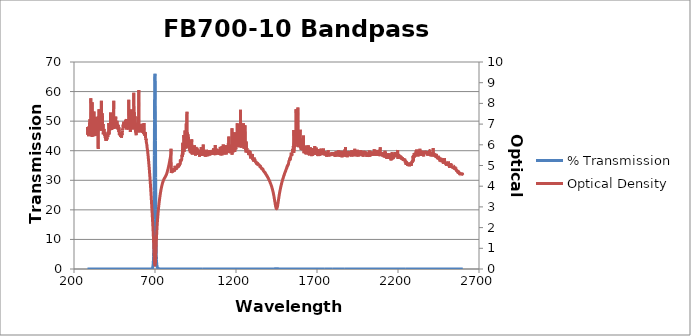
| Category | % Transmission |
|---|---|
| 2600.0 | 0.003 |
| 2599.0 | 0.003 |
| 2598.0 | 0.002 |
| 2597.0 | 0.003 |
| 2596.0 | 0.003 |
| 2595.0 | 0.003 |
| 2594.0 | 0.003 |
| 2593.0 | 0.003 |
| 2592.0 | 0.003 |
| 2591.0 | 0.003 |
| 2590.0 | 0.003 |
| 2589.0 | 0.002 |
| 2588.0 | 0.003 |
| 2587.0 | 0.003 |
| 2586.0 | 0.002 |
| 2585.0 | 0.002 |
| 2584.0 | 0.002 |
| 2583.0 | 0.002 |
| 2582.0 | 0.003 |
| 2581.0 | 0.002 |
| 2580.0 | 0.002 |
| 2579.0 | 0.003 |
| 2578.0 | 0.002 |
| 2577.0 | 0.002 |
| 2576.0 | 0.002 |
| 2575.0 | 0.002 |
| 2574.0 | 0.002 |
| 2573.0 | 0.002 |
| 2572.0 | 0.002 |
| 2571.0 | 0.002 |
| 2570.0 | 0.002 |
| 2569.0 | 0.002 |
| 2568.0 | 0.002 |
| 2567.0 | 0.002 |
| 2566.0 | 0.002 |
| 2565.0 | 0.002 |
| 2564.0 | 0.002 |
| 2563.0 | 0.002 |
| 2562.0 | 0.002 |
| 2561.0 | 0.002 |
| 2560.0 | 0.002 |
| 2559.0 | 0.001 |
| 2558.0 | 0.001 |
| 2557.0 | 0.001 |
| 2556.0 | 0.001 |
| 2555.0 | 0.001 |
| 2554.0 | 0.002 |
| 2553.0 | 0.001 |
| 2552.0 | 0.001 |
| 2551.0 | 0.001 |
| 2550.0 | 0.001 |
| 2549.0 | 0.001 |
| 2548.0 | 0.002 |
| 2547.0 | 0.001 |
| 2546.0 | 0.001 |
| 2545.0 | 0.001 |
| 2544.0 | 0.001 |
| 2543.0 | 0.001 |
| 2542.0 | 0.001 |
| 2541.0 | 0.001 |
| 2540.0 | 0.001 |
| 2539.0 | 0.001 |
| 2538.0 | 0.001 |
| 2537.0 | 0.001 |
| 2536.0 | 0.001 |
| 2535.0 | 0.001 |
| 2534.0 | 0.001 |
| 2533.0 | 0.001 |
| 2532.0 | 0.001 |
| 2531.0 | 0.001 |
| 2530.0 | 0.001 |
| 2529.0 | 0.001 |
| 2528.0 | 0.001 |
| 2527.0 | 0.001 |
| 2526.0 | 0.001 |
| 2525.0 | 0.001 |
| 2524.0 | 0.001 |
| 2523.0 | 0.001 |
| 2522.0 | 0.001 |
| 2521.0 | 0.001 |
| 2520.0 | 0.001 |
| 2519.0 | 0.001 |
| 2518.0 | 0.001 |
| 2517.0 | 0.001 |
| 2516.0 | 0.001 |
| 2515.0 | 0.001 |
| 2514.0 | 0.001 |
| 2513.0 | 0.001 |
| 2512.0 | 0.001 |
| 2511.0 | 0.001 |
| 2510.0 | 0.001 |
| 2509.0 | 0.001 |
| 2508.0 | 0.001 |
| 2507.0 | 0.001 |
| 2506.0 | 0.001 |
| 2505.0 | 0.001 |
| 2504.0 | 0.001 |
| 2503.0 | 0.001 |
| 2502.0 | 0.001 |
| 2501.0 | 0.001 |
| 2500.0 | 0.001 |
| 2499.0 | 0.001 |
| 2498.0 | 0.001 |
| 2497.0 | 0.001 |
| 2496.0 | 0.001 |
| 2495.0 | 0.001 |
| 2494.0 | 0.001 |
| 2493.0 | 0.001 |
| 2492.0 | 0.001 |
| 2491.0 | 0.001 |
| 2490.0 | 0.001 |
| 2489.0 | 0.001 |
| 2488.0 | 0.001 |
| 2487.0 | 0 |
| 2486.0 | 0.001 |
| 2485.0 | 0.001 |
| 2484.0 | 0.001 |
| 2483.0 | 0.001 |
| 2482.0 | 0.001 |
| 2481.0 | 0.001 |
| 2480.0 | 0.001 |
| 2479.0 | 0.001 |
| 2478.0 | 0.001 |
| 2477.0 | 0.001 |
| 2476.0 | 0.001 |
| 2475.0 | 0.001 |
| 2474.0 | 0 |
| 2473.0 | 0 |
| 2472.0 | 0.001 |
| 2471.0 | 0.001 |
| 2470.0 | 0.001 |
| 2469.0 | 0 |
| 2468.0 | 0.001 |
| 2467.0 | 0.001 |
| 2466.0 | 0.001 |
| 2465.0 | 0 |
| 2464.0 | 0.001 |
| 2463.0 | 0 |
| 2462.0 | 0 |
| 2461.0 | 0.001 |
| 2460.0 | 0.001 |
| 2459.0 | 0 |
| 2458.0 | 0.001 |
| 2457.0 | 0.001 |
| 2456.0 | 0 |
| 2455.0 | 0 |
| 2454.0 | 0.001 |
| 2453.0 | 0 |
| 2452.0 | 0 |
| 2451.0 | 0 |
| 2450.0 | 0.001 |
| 2449.0 | 0 |
| 2448.0 | 0 |
| 2447.0 | 0 |
| 2446.0 | 0 |
| 2445.0 | 0 |
| 2444.0 | 0 |
| 2443.0 | 0 |
| 2442.0 | 0 |
| 2441.0 | 0 |
| 2440.0 | 0 |
| 2439.0 | 0 |
| 2438.0 | 0 |
| 2437.0 | 0 |
| 2436.0 | 0 |
| 2435.0 | 0 |
| 2434.0 | 0 |
| 2433.0 | 0 |
| 2432.0 | 0 |
| 2431.0 | 0 |
| 2430.0 | 0 |
| 2429.0 | 0 |
| 2428.0 | 0 |
| 2427.0 | 0 |
| 2426.0 | 0 |
| 2425.0 | 0 |
| 2424.0 | 0 |
| 2423.0 | 0 |
| 2422.0 | 0 |
| 2421.0 | 0 |
| 2420.0 | 0 |
| 2419.0 | 0 |
| 2418.0 | 0 |
| 2417.0 | 0 |
| 2416.0 | 0 |
| 2415.0 | 0 |
| 2414.0 | 0 |
| 2413.0 | 0 |
| 2412.0 | 0 |
| 2411.0 | 0 |
| 2410.0 | 0 |
| 2409.0 | 0 |
| 2408.0 | 0 |
| 2407.0 | 0 |
| 2406.0 | 0 |
| 2405.0 | 0 |
| 2404.0 | 0 |
| 2403.0 | 0 |
| 2402.0 | 0 |
| 2401.0 | 0 |
| 2400.0 | 0 |
| 2399.0 | 0 |
| 2398.0 | 0 |
| 2397.0 | 0 |
| 2396.0 | 0 |
| 2395.0 | 0 |
| 2394.0 | 0 |
| 2393.0 | 0 |
| 2392.0 | 0 |
| 2391.0 | 0 |
| 2390.0 | 0 |
| 2389.0 | 0 |
| 2388.0 | 0 |
| 2387.0 | 0 |
| 2386.0 | 0 |
| 2385.0 | 0 |
| 2384.0 | 0 |
| 2383.0 | 0 |
| 2382.0 | 0 |
| 2381.0 | 0 |
| 2380.0 | 0 |
| 2379.0 | 0 |
| 2378.0 | 0 |
| 2377.0 | 0 |
| 2376.0 | 0 |
| 2375.0 | 0 |
| 2374.0 | 0 |
| 2373.0 | 0 |
| 2372.0 | 0 |
| 2371.0 | 0 |
| 2370.0 | 0 |
| 2369.0 | 0 |
| 2368.0 | 0 |
| 2367.0 | 0 |
| 2366.0 | 0 |
| 2365.0 | 0 |
| 2364.0 | 0 |
| 2363.0 | 0 |
| 2362.0 | 0 |
| 2361.0 | 0 |
| 2360.0 | 0 |
| 2359.0 | 0 |
| 2358.0 | 0 |
| 2357.0 | 0 |
| 2356.0 | 0 |
| 2355.0 | 0 |
| 2354.0 | 0 |
| 2353.0 | 0 |
| 2352.0 | 0 |
| 2351.0 | 0 |
| 2350.0 | 0 |
| 2349.0 | 0 |
| 2348.0 | 0 |
| 2347.0 | 0 |
| 2346.0 | 0 |
| 2345.0 | 0 |
| 2344.0 | 0 |
| 2343.0 | 0 |
| 2342.0 | 0 |
| 2341.0 | 0 |
| 2340.0 | 0 |
| 2339.0 | 0 |
| 2338.0 | 0 |
| 2337.0 | 0 |
| 2336.0 | 0 |
| 2335.0 | 0 |
| 2334.0 | 0 |
| 2333.0 | 0 |
| 2332.0 | 0 |
| 2331.0 | 0 |
| 2330.0 | 0 |
| 2329.0 | 0 |
| 2328.0 | 0 |
| 2327.0 | 0 |
| 2326.0 | 0 |
| 2325.0 | 0 |
| 2324.0 | 0 |
| 2323.0 | 0 |
| 2322.0 | 0 |
| 2321.0 | 0 |
| 2320.0 | 0 |
| 2319.0 | 0 |
| 2318.0 | 0 |
| 2317.0 | 0 |
| 2316.0 | 0 |
| 2315.0 | 0 |
| 2314.0 | 0 |
| 2313.0 | 0 |
| 2312.0 | 0 |
| 2311.0 | 0 |
| 2310.0 | 0 |
| 2309.0 | 0 |
| 2308.0 | 0 |
| 2307.0 | 0 |
| 2306.0 | 0 |
| 2305.0 | 0 |
| 2304.0 | 0 |
| 2303.0 | 0 |
| 2302.0 | 0 |
| 2301.0 | 0 |
| 2300.0 | 0 |
| 2299.0 | 0 |
| 2298.0 | 0 |
| 2297.0 | 0 |
| 2296.0 | 0 |
| 2295.0 | 0.001 |
| 2294.0 | 0.001 |
| 2293.0 | 0 |
| 2292.0 | 0.001 |
| 2291.0 | 0.001 |
| 2290.0 | 0.001 |
| 2289.0 | 0.001 |
| 2288.0 | 0.001 |
| 2287.0 | 0.001 |
| 2286.0 | 0.001 |
| 2285.0 | 0.001 |
| 2284.0 | 0.001 |
| 2283.0 | 0.001 |
| 2282.0 | 0.001 |
| 2281.0 | 0.001 |
| 2280.0 | 0.001 |
| 2279.0 | 0.001 |
| 2278.0 | 0.001 |
| 2277.0 | 0.001 |
| 2276.0 | 0.001 |
| 2275.0 | 0.001 |
| 2274.0 | 0.001 |
| 2273.0 | 0.001 |
| 2272.0 | 0.001 |
| 2271.0 | 0.001 |
| 2270.0 | 0.001 |
| 2269.0 | 0.001 |
| 2268.0 | 0.001 |
| 2267.0 | 0.001 |
| 2266.0 | 0.001 |
| 2265.0 | 0.001 |
| 2264.0 | 0.001 |
| 2263.0 | 0.001 |
| 2262.0 | 0.001 |
| 2261.0 | 0.001 |
| 2260.0 | 0.001 |
| 2259.0 | 0.001 |
| 2258.0 | 0.001 |
| 2257.0 | 0.001 |
| 2256.0 | 0.001 |
| 2255.0 | 0.001 |
| 2254.0 | 0.001 |
| 2253.0 | 0.001 |
| 2252.0 | 0.001 |
| 2251.0 | 0.001 |
| 2250.0 | 0.001 |
| 2249.0 | 0.001 |
| 2248.0 | 0.001 |
| 2247.0 | 0.001 |
| 2246.0 | 0.001 |
| 2245.0 | 0.001 |
| 2244.0 | 0.001 |
| 2243.0 | 0.001 |
| 2242.0 | 0 |
| 2241.0 | 0.001 |
| 2240.0 | 0.001 |
| 2239.0 | 0.001 |
| 2238.0 | 0 |
| 2237.0 | 0.001 |
| 2236.0 | 0.001 |
| 2235.0 | 0.001 |
| 2234.0 | 0.001 |
| 2233.0 | 0.001 |
| 2232.0 | 0 |
| 2231.0 | 0 |
| 2230.0 | 0 |
| 2229.0 | 0.001 |
| 2228.0 | 0 |
| 2227.0 | 0.001 |
| 2226.0 | 0 |
| 2225.0 | 0 |
| 2224.0 | 0 |
| 2223.0 | 0 |
| 2222.0 | 0.001 |
| 2221.0 | 0 |
| 2220.0 | 0 |
| 2219.0 | 0 |
| 2218.0 | 0 |
| 2217.0 | 0 |
| 2216.0 | 0 |
| 2215.0 | 0 |
| 2214.0 | 0 |
| 2213.0 | 0 |
| 2212.0 | 0 |
| 2211.0 | 0 |
| 2210.0 | 0 |
| 2209.0 | 0 |
| 2208.0 | 0 |
| 2207.0 | 0 |
| 2206.0 | 0 |
| 2205.0 | 0 |
| 2204.0 | 0 |
| 2203.0 | 0 |
| 2202.0 | 0 |
| 2201.0 | 0 |
| 2200.0 | 0 |
| 2199.0 | 0 |
| 2198.0 | 0 |
| 2197.0 | 0 |
| 2196.0 | 0 |
| 2195.0 | 0 |
| 2194.0 | 0 |
| 2193.0 | 0 |
| 2192.0 | 0 |
| 2191.0 | 0 |
| 2190.0 | 0 |
| 2189.0 | 0 |
| 2188.0 | 0 |
| 2187.0 | 0 |
| 2186.0 | 0 |
| 2185.0 | 0 |
| 2184.0 | 0 |
| 2183.0 | 0 |
| 2182.0 | 0 |
| 2181.0 | 0 |
| 2180.0 | 0 |
| 2179.0 | 0 |
| 2178.0 | 0 |
| 2177.0 | 0 |
| 2176.0 | 0 |
| 2175.0 | 0 |
| 2174.0 | 0 |
| 2173.0 | 0 |
| 2172.0 | 0 |
| 2171.0 | 0 |
| 2170.0 | 0 |
| 2169.0 | 0 |
| 2168.0 | 0 |
| 2167.0 | 0 |
| 2166.0 | 0 |
| 2165.0 | 0 |
| 2164.0 | 0 |
| 2163.0 | 0 |
| 2162.0 | 0 |
| 2161.0 | 0 |
| 2160.0 | 0 |
| 2159.0 | 0.001 |
| 2158.0 | 0 |
| 2157.0 | 0.001 |
| 2156.0 | 0 |
| 2155.0 | 0 |
| 2154.0 | 0 |
| 2153.0 | 0 |
| 2152.0 | 0 |
| 2151.0 | 0 |
| 2150.0 | 0 |
| 2149.0 | 0 |
| 2148.0 | 0 |
| 2147.0 | 0 |
| 2146.0 | 0 |
| 2145.0 | 0 |
| 2144.0 | 0 |
| 2143.0 | 0 |
| 2142.0 | 0 |
| 2141.0 | 0 |
| 2140.0 | 0 |
| 2139.0 | 0 |
| 2138.0 | 0 |
| 2137.0 | 0 |
| 2136.0 | 0 |
| 2135.0 | 0 |
| 2134.0 | 0 |
| 2133.0 | 0 |
| 2132.0 | 0 |
| 2131.0 | 0 |
| 2130.0 | 0 |
| 2129.0 | 0 |
| 2128.0 | 0 |
| 2127.0 | 0 |
| 2126.0 | 0 |
| 2125.0 | 0 |
| 2124.0 | 0 |
| 2123.0 | 0 |
| 2122.0 | 0 |
| 2121.0 | 0 |
| 2120.0 | 0 |
| 2119.0 | 0 |
| 2118.0 | 0 |
| 2117.0 | 0 |
| 2116.0 | 0 |
| 2115.0 | 0 |
| 2114.0 | 0 |
| 2113.0 | 0 |
| 2112.0 | 0 |
| 2111.0 | 0 |
| 2110.0 | 0 |
| 2109.0 | 0 |
| 2108.0 | 0 |
| 2107.0 | 0 |
| 2106.0 | 0 |
| 2105.0 | 0 |
| 2104.0 | 0 |
| 2103.0 | 0 |
| 2102.0 | 0 |
| 2101.0 | 0 |
| 2100.0 | 0 |
| 2099.0 | 0 |
| 2098.0 | 0 |
| 2097.0 | 0 |
| 2096.0 | 0 |
| 2095.0 | 0 |
| 2094.0 | 0 |
| 2093.0 | 0 |
| 2092.0 | 0 |
| 2091.0 | 0 |
| 2090.0 | 0 |
| 2089.0 | 0 |
| 2088.0 | 0 |
| 2087.0 | 0 |
| 2086.0 | 0 |
| 2085.0 | 0 |
| 2084.0 | 0 |
| 2083.0 | 0 |
| 2082.0 | 0 |
| 2081.0 | 0 |
| 2080.0 | 0 |
| 2079.0 | 0 |
| 2078.0 | 0 |
| 2077.0 | 0 |
| 2076.0 | 0 |
| 2075.0 | 0 |
| 2074.0 | 0 |
| 2073.0 | 0 |
| 2072.0 | 0 |
| 2071.0 | 0 |
| 2070.0 | 0 |
| 2069.0 | 0 |
| 2068.0 | 0 |
| 2067.0 | 0 |
| 2066.0 | 0 |
| 2065.0 | 0 |
| 2064.0 | 0 |
| 2063.0 | 0 |
| 2062.0 | 0 |
| 2061.0 | 0 |
| 2060.0 | 0 |
| 2059.0 | 0 |
| 2058.0 | 0 |
| 2057.0 | 0 |
| 2056.0 | 0 |
| 2055.0 | 0 |
| 2054.0 | 0 |
| 2053.0 | 0 |
| 2052.0 | 0 |
| 2051.0 | 0 |
| 2050.0 | 0 |
| 2049.0 | 0 |
| 2048.0 | 0 |
| 2047.0 | 0 |
| 2046.0 | 0 |
| 2045.0 | 0 |
| 2044.0 | 0 |
| 2043.0 | 0 |
| 2042.0 | 0 |
| 2041.0 | 0 |
| 2040.0 | 0 |
| 2039.0 | 0 |
| 2038.0 | 0 |
| 2037.0 | 0 |
| 2036.0 | 0 |
| 2035.0 | 0 |
| 2034.0 | 0 |
| 2033.0 | 0 |
| 2032.0 | 0 |
| 2031.0 | 0 |
| 2030.0 | 0 |
| 2029.0 | 0 |
| 2028.0 | 0 |
| 2027.0 | 0 |
| 2026.0 | 0 |
| 2025.0 | 0 |
| 2024.0 | 0 |
| 2023.0 | 0 |
| 2022.0 | 0 |
| 2021.0 | 0 |
| 2020.0 | 0 |
| 2019.0 | 0 |
| 2018.0 | 0 |
| 2017.0 | 0 |
| 2016.0 | 0 |
| 2015.0 | 0 |
| 2014.0 | 0 |
| 2013.0 | 0 |
| 2012.0 | 0 |
| 2011.0 | 0 |
| 2010.0 | 0 |
| 2009.0 | 0 |
| 2008.0 | 0 |
| 2007.0 | 0 |
| 2006.0 | 0 |
| 2005.0 | 0 |
| 2004.0 | 0 |
| 2003.0 | 0 |
| 2002.0 | 0 |
| 2001.0 | 0 |
| 2000.0 | 0 |
| 1999.0 | 0 |
| 1998.0 | 0 |
| 1997.0 | 0 |
| 1996.0 | 0 |
| 1995.0 | 0 |
| 1994.0 | 0 |
| 1993.0 | 0 |
| 1992.0 | 0 |
| 1991.0 | 0 |
| 1990.0 | 0 |
| 1989.0 | 0 |
| 1988.0 | 0 |
| 1987.0 | 0 |
| 1986.0 | 0 |
| 1985.0 | 0 |
| 1984.0 | 0 |
| 1983.0 | 0 |
| 1982.0 | 0 |
| 1981.0 | 0 |
| 1980.0 | 0 |
| 1979.0 | 0 |
| 1978.0 | 0 |
| 1977.0 | 0 |
| 1976.0 | 0 |
| 1975.0 | 0 |
| 1974.0 | 0 |
| 1973.0 | 0 |
| 1972.0 | 0 |
| 1971.0 | 0 |
| 1970.0 | 0 |
| 1969.0 | 0 |
| 1968.0 | 0 |
| 1967.0 | 0 |
| 1966.0 | 0 |
| 1965.0 | 0 |
| 1964.0 | 0 |
| 1963.0 | 0 |
| 1962.0 | 0 |
| 1961.0 | 0 |
| 1960.0 | 0 |
| 1959.0 | 0 |
| 1958.0 | 0 |
| 1957.0 | 0 |
| 1956.0 | 0 |
| 1955.0 | 0 |
| 1954.0 | 0 |
| 1953.0 | 0 |
| 1952.0 | 0 |
| 1951.0 | 0 |
| 1950.0 | 0 |
| 1949.0 | 0 |
| 1948.0 | 0 |
| 1947.0 | 0 |
| 1946.0 | 0 |
| 1945.0 | 0 |
| 1944.0 | 0 |
| 1943.0 | 0 |
| 1942.0 | 0 |
| 1941.0 | 0 |
| 1940.0 | 0 |
| 1939.0 | 0 |
| 1938.0 | 0 |
| 1937.0 | 0 |
| 1936.0 | 0 |
| 1935.0 | 0 |
| 1934.0 | 0 |
| 1933.0 | 0 |
| 1932.0 | 0 |
| 1931.0 | 0 |
| 1930.0 | 0 |
| 1929.0 | 0 |
| 1928.0 | 0 |
| 1927.0 | 0 |
| 1926.0 | 0 |
| 1925.0 | 0 |
| 1924.0 | 0 |
| 1923.0 | 0 |
| 1922.0 | 0 |
| 1921.0 | 0 |
| 1920.0 | 0 |
| 1919.0 | 0 |
| 1918.0 | 0 |
| 1917.0 | 0 |
| 1916.0 | 0 |
| 1915.0 | 0 |
| 1914.0 | 0 |
| 1913.0 | 0 |
| 1912.0 | 0 |
| 1911.0 | 0 |
| 1910.0 | 0 |
| 1909.0 | 0 |
| 1908.0 | 0 |
| 1907.0 | 0 |
| 1906.0 | 0 |
| 1905.0 | 0 |
| 1904.0 | 0 |
| 1903.0 | 0 |
| 1902.0 | 0 |
| 1901.0 | 0 |
| 1900.0 | 0 |
| 1899.0 | 0 |
| 1898.0 | 0 |
| 1897.0 | 0 |
| 1896.0 | 0 |
| 1895.0 | 0 |
| 1894.0 | 0 |
| 1893.0 | 0 |
| 1892.0 | 0 |
| 1891.0 | 0 |
| 1890.0 | 0 |
| 1889.0 | 0 |
| 1888.0 | 0 |
| 1887.0 | 0 |
| 1886.0 | 0 |
| 1885.0 | 0 |
| 1884.0 | 0 |
| 1883.0 | 0 |
| 1882.0 | 0 |
| 1881.0 | 0 |
| 1880.0 | 0 |
| 1879.0 | 0 |
| 1878.0 | 0 |
| 1877.0 | 0 |
| 1876.0 | 0 |
| 1875.0 | 0 |
| 1874.0 | 0 |
| 1873.0 | 0 |
| 1872.0 | 0 |
| 1871.0 | 0 |
| 1870.0 | 0 |
| 1869.0 | 0 |
| 1868.0 | 0 |
| 1867.0 | 0 |
| 1866.0 | 0 |
| 1865.0 | 0 |
| 1864.0 | 0 |
| 1863.0 | 0 |
| 1862.0 | 0 |
| 1861.0 | 0 |
| 1860.0 | 0 |
| 1859.0 | 0 |
| 1858.0 | 0 |
| 1857.0 | 0 |
| 1856.0 | 0 |
| 1855.0 | 0 |
| 1854.0 | 0 |
| 1853.0 | 0 |
| 1852.0 | 0 |
| 1851.0 | 0 |
| 1850.0 | 0 |
| 1849.0 | 0 |
| 1848.0 | 0 |
| 1847.0 | 0 |
| 1846.0 | 0 |
| 1845.0 | 0 |
| 1844.0 | 0 |
| 1843.0 | 0 |
| 1842.0 | 0 |
| 1841.0 | 0 |
| 1840.0 | 0 |
| 1839.0 | 0 |
| 1838.0 | 0 |
| 1837.0 | 0 |
| 1836.0 | 0 |
| 1835.0 | 0 |
| 1834.0 | 0 |
| 1833.0 | 0 |
| 1832.0 | 0 |
| 1831.0 | 0 |
| 1830.0 | 0 |
| 1829.0 | 0 |
| 1828.0 | 0 |
| 1827.0 | 0 |
| 1826.0 | 0 |
| 1825.0 | 0 |
| 1824.0 | 0 |
| 1823.0 | 0 |
| 1822.0 | 0 |
| 1821.0 | 0 |
| 1820.0 | 0 |
| 1819.0 | 0 |
| 1818.0 | 0 |
| 1817.0 | 0 |
| 1816.0 | 0 |
| 1815.0 | 0 |
| 1814.0 | 0 |
| 1813.0 | 0 |
| 1812.0 | 0 |
| 1811.0 | 0 |
| 1810.0 | 0 |
| 1809.0 | 0 |
| 1808.0 | 0 |
| 1807.0 | 0 |
| 1806.0 | 0 |
| 1805.0 | 0 |
| 1804.0 | 0 |
| 1803.0 | 0 |
| 1802.0 | 0 |
| 1801.0 | 0 |
| 1800.0 | 0 |
| 1799.0 | 0 |
| 1798.0 | 0 |
| 1797.0 | 0 |
| 1796.0 | 0 |
| 1795.0 | 0 |
| 1794.0 | 0 |
| 1793.0 | 0 |
| 1792.0 | 0 |
| 1791.0 | 0 |
| 1790.0 | 0 |
| 1789.0 | 0 |
| 1788.0 | 0 |
| 1787.0 | 0 |
| 1786.0 | 0 |
| 1785.0 | 0 |
| 1784.0 | 0 |
| 1783.0 | 0 |
| 1782.0 | 0 |
| 1781.0 | 0 |
| 1780.0 | 0 |
| 1779.0 | 0 |
| 1778.0 | 0 |
| 1777.0 | 0 |
| 1776.0 | 0 |
| 1775.0 | 0 |
| 1774.0 | 0 |
| 1773.0 | 0 |
| 1772.0 | 0 |
| 1771.0 | 0 |
| 1770.0 | 0 |
| 1769.0 | 0 |
| 1768.0 | 0 |
| 1767.0 | 0 |
| 1766.0 | 0 |
| 1765.0 | 0 |
| 1764.0 | 0 |
| 1763.0 | 0 |
| 1762.0 | 0 |
| 1761.0 | 0 |
| 1760.0 | 0 |
| 1759.0 | 0 |
| 1758.0 | 0 |
| 1757.0 | 0 |
| 1756.0 | 0 |
| 1755.0 | 0 |
| 1754.0 | 0 |
| 1753.0 | 0 |
| 1752.0 | 0 |
| 1751.0 | 0 |
| 1750.0 | 0 |
| 1749.0 | 0 |
| 1748.0 | 0 |
| 1747.0 | 0 |
| 1746.0 | 0 |
| 1745.0 | 0 |
| 1744.0 | 0 |
| 1743.0 | 0 |
| 1742.0 | 0 |
| 1741.0 | 0 |
| 1740.0 | 0 |
| 1739.0 | 0 |
| 1738.0 | 0 |
| 1737.0 | 0 |
| 1736.0 | 0 |
| 1735.0 | 0 |
| 1734.0 | 0 |
| 1733.0 | 0 |
| 1732.0 | 0 |
| 1731.0 | 0 |
| 1730.0 | 0 |
| 1729.0 | 0 |
| 1728.0 | 0 |
| 1727.0 | 0 |
| 1726.0 | 0 |
| 1725.0 | 0 |
| 1724.0 | 0 |
| 1723.0 | 0 |
| 1722.0 | 0 |
| 1721.0 | 0 |
| 1720.0 | 0 |
| 1719.0 | 0 |
| 1718.0 | 0 |
| 1717.0 | 0 |
| 1716.0 | 0 |
| 1715.0 | 0 |
| 1714.0 | 0 |
| 1713.0 | 0 |
| 1712.0 | 0 |
| 1711.0 | 0 |
| 1710.0 | 0 |
| 1709.0 | 0 |
| 1708.0 | 0 |
| 1707.0 | 0 |
| 1706.0 | 0 |
| 1705.0 | 0 |
| 1704.0 | 0 |
| 1703.0 | 0 |
| 1702.0 | 0 |
| 1701.0 | 0 |
| 1700.0 | 0 |
| 1699.0 | 0 |
| 1698.0 | 0 |
| 1697.0 | 0 |
| 1696.0 | 0 |
| 1695.0 | 0 |
| 1694.0 | 0 |
| 1693.0 | 0 |
| 1692.0 | 0 |
| 1691.0 | 0 |
| 1690.0 | 0 |
| 1689.0 | 0 |
| 1688.0 | 0 |
| 1687.0 | 0 |
| 1686.0 | 0 |
| 1685.0 | 0 |
| 1684.0 | 0 |
| 1683.0 | 0 |
| 1682.0 | 0 |
| 1681.0 | 0 |
| 1680.0 | 0 |
| 1679.0 | 0 |
| 1678.0 | 0 |
| 1677.0 | 0 |
| 1676.0 | 0 |
| 1675.0 | 0 |
| 1674.0 | 0 |
| 1673.0 | 0 |
| 1672.0 | 0 |
| 1671.0 | 0 |
| 1670.0 | 0 |
| 1669.0 | 0 |
| 1668.0 | 0 |
| 1667.0 | 0 |
| 1666.0 | 0 |
| 1665.0 | 0 |
| 1664.0 | 0 |
| 1663.0 | 0 |
| 1662.0 | 0 |
| 1661.0 | 0 |
| 1660.0 | 0 |
| 1659.0 | 0 |
| 1658.0 | 0 |
| 1657.0 | 0 |
| 1656.0 | 0 |
| 1655.0 | 0 |
| 1654.0 | 0 |
| 1653.0 | 0 |
| 1652.0 | 0 |
| 1651.0 | 0 |
| 1650.0 | 0 |
| 1649.0 | 0 |
| 1648.0 | 0 |
| 1647.0 | 0 |
| 1646.0 | 0 |
| 1645.0 | 0 |
| 1644.0 | 0 |
| 1643.0 | 0 |
| 1642.0 | 0 |
| 1641.0 | 0 |
| 1640.0 | 0 |
| 1639.0 | 0 |
| 1638.0 | 0 |
| 1637.0 | 0 |
| 1636.0 | 0 |
| 1635.0 | 0 |
| 1634.0 | 0 |
| 1633.0 | 0 |
| 1632.0 | 0 |
| 1631.0 | 0 |
| 1630.0 | 0 |
| 1629.0 | 0 |
| 1628.0 | 0 |
| 1627.0 | 0 |
| 1626.0 | 0 |
| 1625.0 | 0 |
| 1624.0 | 0 |
| 1623.0 | 0 |
| 1622.0 | 0 |
| 1621.0 | 0 |
| 1620.0 | 0 |
| 1619.0 | 0 |
| 1618.0 | 0 |
| 1617.0 | 0 |
| 1616.0 | 0 |
| 1615.0 | 0 |
| 1614.0 | 0 |
| 1613.0 | 0 |
| 1612.0 | 0 |
| 1611.0 | 0 |
| 1610.0 | 0 |
| 1609.0 | 0 |
| 1608.0 | 0 |
| 1607.0 | 0 |
| 1606.0 | 0 |
| 1605.0 | 0 |
| 1604.0 | 0 |
| 1603.0 | 0 |
| 1602.0 | 0 |
| 1601.0 | 0 |
| 1600.0 | 0 |
| 1599.0 | 0 |
| 1598.0 | 0 |
| 1597.0 | 0 |
| 1596.0 | 0 |
| 1595.0 | 0 |
| 1594.0 | 0 |
| 1593.0 | 0 |
| 1592.0 | 0 |
| 1591.0 | 0 |
| 1590.0 | 0 |
| 1589.0 | 0 |
| 1588.0 | 0 |
| 1587.0 | 0 |
| 1586.0 | 0 |
| 1585.0 | 0 |
| 1584.0 | 0 |
| 1583.0 | 0 |
| 1582.0 | 0 |
| 1581.0 | 0 |
| 1580.0 | 0 |
| 1579.0 | 0 |
| 1578.0 | 0 |
| 1577.0 | 0 |
| 1576.0 | 0 |
| 1575.0 | 0 |
| 1574.0 | 0 |
| 1573.0 | 0 |
| 1572.0 | 0 |
| 1571.0 | 0 |
| 1570.0 | 0 |
| 1569.0 | 0 |
| 1568.0 | 0 |
| 1567.0 | 0 |
| 1566.0 | 0 |
| 1565.0 | 0 |
| 1564.0 | 0 |
| 1563.0 | 0 |
| 1562.0 | 0 |
| 1561.0 | 0 |
| 1560.0 | 0 |
| 1559.0 | 0 |
| 1558.0 | 0 |
| 1557.0 | 0 |
| 1556.0 | 0 |
| 1555.0 | 0 |
| 1554.0 | 0 |
| 1553.0 | 0 |
| 1552.0 | 0 |
| 1551.0 | 0 |
| 1550.0 | 0 |
| 1549.0 | 0 |
| 1548.0 | 0 |
| 1547.0 | 0 |
| 1546.0 | 0 |
| 1545.0 | 0 |
| 1544.0 | 0 |
| 1543.0 | 0 |
| 1542.0 | 0 |
| 1541.0 | 0 |
| 1540.0 | 0 |
| 1539.0 | 0 |
| 1538.0 | 0 |
| 1537.0 | 0 |
| 1536.0 | 0 |
| 1535.0 | 0 |
| 1534.0 | 0.001 |
| 1533.0 | 0 |
| 1532.0 | 0 |
| 1531.0 | 0.001 |
| 1530.0 | 0 |
| 1529.0 | 0.001 |
| 1528.0 | 0.001 |
| 1527.0 | 0.001 |
| 1526.0 | 0.001 |
| 1525.0 | 0.001 |
| 1524.0 | 0.001 |
| 1523.0 | 0.001 |
| 1522.0 | 0.001 |
| 1521.0 | 0.001 |
| 1520.0 | 0.001 |
| 1519.0 | 0.001 |
| 1518.0 | 0.001 |
| 1517.0 | 0.001 |
| 1516.0 | 0.001 |
| 1515.0 | 0.001 |
| 1514.0 | 0.001 |
| 1513.0 | 0.001 |
| 1512.0 | 0.001 |
| 1511.0 | 0.001 |
| 1510.0 | 0.002 |
| 1509.0 | 0.002 |
| 1508.0 | 0.002 |
| 1507.0 | 0.002 |
| 1506.0 | 0.002 |
| 1505.0 | 0.002 |
| 1504.0 | 0.002 |
| 1503.0 | 0.002 |
| 1502.0 | 0.002 |
| 1501.0 | 0.002 |
| 1500.0 | 0.002 |
| 1499.0 | 0.003 |
| 1498.0 | 0.003 |
| 1497.0 | 0.003 |
| 1496.0 | 0.003 |
| 1495.0 | 0.003 |
| 1494.0 | 0.003 |
| 1493.0 | 0.004 |
| 1492.0 | 0.004 |
| 1491.0 | 0.004 |
| 1490.0 | 0.004 |
| 1489.0 | 0.004 |
| 1488.0 | 0.005 |
| 1487.0 | 0.005 |
| 1486.0 | 0.005 |
| 1485.0 | 0.006 |
| 1484.0 | 0.006 |
| 1483.0 | 0.007 |
| 1482.0 | 0.007 |
| 1481.0 | 0.008 |
| 1480.0 | 0.008 |
| 1479.0 | 0.009 |
| 1478.0 | 0.01 |
| 1477.0 | 0.01 |
| 1476.0 | 0.011 |
| 1475.0 | 0.012 |
| 1474.0 | 0.013 |
| 1473.0 | 0.015 |
| 1472.0 | 0.016 |
| 1471.0 | 0.018 |
| 1470.0 | 0.019 |
| 1469.0 | 0.021 |
| 1468.0 | 0.024 |
| 1467.0 | 0.026 |
| 1466.0 | 0.03 |
| 1465.0 | 0.033 |
| 1464.0 | 0.037 |
| 1463.0 | 0.042 |
| 1462.0 | 0.047 |
| 1461.0 | 0.054 |
| 1460.0 | 0.061 |
| 1459.0 | 0.068 |
| 1458.0 | 0.076 |
| 1457.0 | 0.085 |
| 1456.0 | 0.094 |
| 1455.0 | 0.102 |
| 1454.0 | 0.109 |
| 1453.0 | 0.116 |
| 1452.0 | 0.12 |
| 1451.0 | 0.123 |
| 1450.0 | 0.123 |
| 1449.0 | 0.121 |
| 1448.0 | 0.117 |
| 1447.0 | 0.111 |
| 1446.0 | 0.104 |
| 1445.0 | 0.097 |
| 1444.0 | 0.088 |
| 1443.0 | 0.08 |
| 1442.0 | 0.072 |
| 1441.0 | 0.064 |
| 1440.0 | 0.057 |
| 1439.0 | 0.051 |
| 1438.0 | 0.046 |
| 1437.0 | 0.041 |
| 1436.0 | 0.037 |
| 1435.0 | 0.033 |
| 1434.0 | 0.03 |
| 1433.0 | 0.027 |
| 1432.0 | 0.025 |
| 1431.0 | 0.023 |
| 1430.0 | 0.021 |
| 1429.0 | 0.019 |
| 1428.0 | 0.018 |
| 1427.0 | 0.016 |
| 1426.0 | 0.015 |
| 1425.0 | 0.014 |
| 1424.0 | 0.013 |
| 1423.0 | 0.013 |
| 1422.0 | 0.012 |
| 1421.0 | 0.011 |
| 1420.0 | 0.01 |
| 1419.0 | 0.01 |
| 1418.0 | 0.009 |
| 1417.0 | 0.009 |
| 1416.0 | 0.008 |
| 1415.0 | 0.008 |
| 1414.0 | 0.008 |
| 1413.0 | 0.007 |
| 1412.0 | 0.007 |
| 1411.0 | 0.007 |
| 1410.0 | 0.006 |
| 1409.0 | 0.006 |
| 1408.0 | 0.006 |
| 1407.0 | 0.006 |
| 1406.0 | 0.005 |
| 1405.0 | 0.005 |
| 1404.0 | 0.005 |
| 1403.0 | 0.005 |
| 1402.0 | 0.005 |
| 1401.0 | 0.004 |
| 1400.0 | 0.004 |
| 1399.0 | 0.004 |
| 1398.0 | 0.004 |
| 1397.0 | 0.004 |
| 1396.0 | 0.004 |
| 1395.0 | 0.004 |
| 1394.0 | 0.003 |
| 1393.0 | 0.003 |
| 1392.0 | 0.003 |
| 1391.0 | 0.003 |
| 1390.0 | 0.003 |
| 1389.0 | 0.003 |
| 1388.0 | 0.003 |
| 1387.0 | 0.003 |
| 1386.0 | 0.003 |
| 1385.0 | 0.003 |
| 1384.0 | 0.003 |
| 1383.0 | 0.002 |
| 1382.0 | 0.002 |
| 1381.0 | 0.002 |
| 1380.0 | 0.002 |
| 1379.0 | 0.002 |
| 1378.0 | 0.002 |
| 1377.0 | 0.002 |
| 1376.0 | 0.002 |
| 1375.0 | 0.002 |
| 1374.0 | 0.002 |
| 1373.0 | 0.002 |
| 1372.0 | 0.002 |
| 1371.0 | 0.002 |
| 1370.0 | 0.002 |
| 1369.0 | 0.002 |
| 1368.0 | 0.002 |
| 1367.0 | 0.002 |
| 1366.0 | 0.001 |
| 1365.0 | 0.001 |
| 1364.0 | 0.002 |
| 1363.0 | 0.001 |
| 1362.0 | 0.001 |
| 1361.0 | 0.001 |
| 1360.0 | 0.001 |
| 1359.0 | 0.001 |
| 1358.0 | 0.001 |
| 1357.0 | 0.001 |
| 1356.0 | 0.001 |
| 1355.0 | 0.001 |
| 1354.0 | 0.001 |
| 1353.0 | 0.001 |
| 1352.0 | 0.001 |
| 1351.0 | 0.001 |
| 1350.0 | 0.001 |
| 1349.0 | 0.001 |
| 1348.0 | 0.001 |
| 1347.0 | 0.001 |
| 1346.0 | 0.001 |
| 1345.0 | 0.001 |
| 1344.0 | 0.001 |
| 1343.0 | 0.001 |
| 1342.0 | 0.001 |
| 1341.0 | 0.001 |
| 1340.0 | 0.001 |
| 1339.0 | 0.001 |
| 1338.0 | 0.001 |
| 1337.0 | 0.001 |
| 1336.0 | 0.001 |
| 1335.0 | 0.001 |
| 1334.0 | 0.001 |
| 1333.0 | 0.001 |
| 1332.0 | 0.001 |
| 1331.0 | 0.001 |
| 1330.0 | 0.001 |
| 1329.0 | 0.001 |
| 1328.0 | 0.001 |
| 1327.0 | 0.001 |
| 1326.0 | 0.001 |
| 1325.0 | 0.001 |
| 1324.0 | 0.001 |
| 1323.0 | 0.001 |
| 1322.0 | 0.001 |
| 1321.0 | 0.001 |
| 1320.0 | 0.001 |
| 1319.0 | 0.001 |
| 1318.0 | 0.001 |
| 1317.0 | 0.001 |
| 1316.0 | 0 |
| 1315.0 | 0.001 |
| 1314.0 | 0.001 |
| 1313.0 | 0.001 |
| 1312.0 | 0 |
| 1311.0 | 0 |
| 1310.0 | 0.001 |
| 1309.0 | 0 |
| 1308.0 | 0.001 |
| 1307.0 | 0.001 |
| 1306.0 | 0.001 |
| 1305.0 | 0 |
| 1304.0 | 0.001 |
| 1303.0 | 0 |
| 1302.0 | 0 |
| 1301.0 | 0 |
| 1300.0 | 0 |
| 1299.0 | 0 |
| 1298.0 | 0 |
| 1297.0 | 0 |
| 1296.0 | 0 |
| 1295.0 | 0 |
| 1294.0 | 0 |
| 1293.0 | 0 |
| 1292.0 | 0 |
| 1291.0 | 0 |
| 1290.0 | 0 |
| 1289.0 | 0 |
| 1288.0 | 0 |
| 1287.0 | 0 |
| 1286.0 | 0 |
| 1285.0 | 0 |
| 1284.0 | 0 |
| 1283.0 | 0 |
| 1282.0 | 0 |
| 1281.0 | 0 |
| 1280.0 | 0 |
| 1279.0 | 0 |
| 1278.0 | 0 |
| 1277.0 | 0 |
| 1276.0 | 0 |
| 1275.0 | 0 |
| 1274.0 | 0 |
| 1273.0 | 0 |
| 1272.0 | 0 |
| 1271.0 | 0 |
| 1270.0 | 0 |
| 1269.0 | 0 |
| 1268.0 | 0 |
| 1267.0 | 0 |
| 1266.0 | 0 |
| 1265.0 | 0 |
| 1264.0 | 0 |
| 1263.0 | 0 |
| 1262.0 | 0 |
| 1261.0 | 0 |
| 1260.0 | 0 |
| 1259.0 | 0 |
| 1258.0 | 0 |
| 1257.0 | 0 |
| 1256.0 | 0 |
| 1255.0 | 0 |
| 1254.0 | 0 |
| 1253.0 | 0 |
| 1252.0 | 0 |
| 1251.0 | 0 |
| 1250.0 | 0 |
| 1249.0 | 0 |
| 1248.0 | 0 |
| 1247.0 | 0 |
| 1246.0 | 0 |
| 1245.0 | 0 |
| 1244.0 | 0 |
| 1243.0 | 0 |
| 1242.0 | 0 |
| 1241.0 | 0 |
| 1240.0 | 0 |
| 1239.0 | 0 |
| 1238.0 | 0 |
| 1237.0 | 0 |
| 1236.0 | 0 |
| 1235.0 | 0 |
| 1234.0 | 0 |
| 1233.0 | 0 |
| 1232.0 | 0 |
| 1231.0 | 0 |
| 1230.0 | 0 |
| 1229.0 | 0 |
| 1228.0 | 0 |
| 1227.0 | 0 |
| 1226.0 | 0 |
| 1225.0 | 0 |
| 1224.0 | 0 |
| 1223.0 | 0 |
| 1222.0 | 0 |
| 1221.0 | 0 |
| 1220.0 | 0 |
| 1219.0 | 0 |
| 1218.0 | 0 |
| 1217.0 | 0 |
| 1216.0 | 0 |
| 1215.0 | 0 |
| 1214.0 | 0 |
| 1213.0 | 0 |
| 1212.0 | 0 |
| 1211.0 | 0 |
| 1210.0 | 0 |
| 1209.0 | 0 |
| 1208.0 | 0 |
| 1207.0 | 0 |
| 1206.0 | 0 |
| 1205.0 | 0 |
| 1204.0 | 0 |
| 1203.0 | 0 |
| 1202.0 | 0 |
| 1201.0 | 0 |
| 1200.0 | 0 |
| 1199.0 | 0 |
| 1198.0 | 0 |
| 1197.0 | 0 |
| 1196.0 | 0 |
| 1195.0 | 0 |
| 1194.0 | 0 |
| 1193.0 | 0 |
| 1192.0 | 0 |
| 1191.0 | 0 |
| 1190.0 | 0 |
| 1189.0 | 0 |
| 1188.0 | 0 |
| 1187.0 | 0 |
| 1186.0 | 0 |
| 1185.0 | 0 |
| 1184.0 | 0 |
| 1183.0 | 0 |
| 1182.0 | 0 |
| 1181.0 | 0 |
| 1180.0 | 0 |
| 1179.0 | 0 |
| 1178.0 | 0 |
| 1177.0 | 0 |
| 1176.0 | 0 |
| 1175.0 | 0 |
| 1174.0 | 0 |
| 1173.0 | 0 |
| 1172.0 | 0 |
| 1171.0 | 0 |
| 1170.0 | 0 |
| 1169.0 | 0 |
| 1168.0 | 0 |
| 1167.0 | 0 |
| 1166.0 | 0 |
| 1165.0 | 0 |
| 1164.0 | 0 |
| 1163.0 | 0 |
| 1162.0 | 0 |
| 1161.0 | 0 |
| 1160.0 | 0 |
| 1159.0 | 0 |
| 1158.0 | 0 |
| 1157.0 | 0 |
| 1156.0 | 0 |
| 1155.0 | 0 |
| 1154.0 | 0 |
| 1153.0 | 0 |
| 1152.0 | 0 |
| 1151.0 | 0 |
| 1150.0 | 0 |
| 1149.0 | 0 |
| 1148.0 | 0 |
| 1147.0 | 0 |
| 1146.0 | 0 |
| 1145.0 | 0 |
| 1144.0 | 0 |
| 1143.0 | 0 |
| 1142.0 | 0 |
| 1141.0 | 0 |
| 1140.0 | 0 |
| 1139.0 | 0 |
| 1138.0 | 0 |
| 1137.0 | 0 |
| 1136.0 | 0 |
| 1135.0 | 0 |
| 1134.0 | 0 |
| 1133.0 | 0 |
| 1132.0 | 0 |
| 1131.0 | 0 |
| 1130.0 | 0 |
| 1129.0 | 0 |
| 1128.0 | 0 |
| 1127.0 | 0 |
| 1126.0 | 0 |
| 1125.0 | 0 |
| 1124.0 | 0 |
| 1123.0 | 0 |
| 1122.0 | 0 |
| 1121.0 | 0 |
| 1120.0 | 0 |
| 1119.0 | 0 |
| 1118.0 | 0 |
| 1117.0 | 0 |
| 1116.0 | 0 |
| 1115.0 | 0 |
| 1114.0 | 0 |
| 1113.0 | 0 |
| 1112.0 | 0 |
| 1111.0 | 0 |
| 1110.0 | 0 |
| 1109.0 | 0 |
| 1108.0 | 0 |
| 1107.0 | 0 |
| 1106.0 | 0 |
| 1105.0 | 0 |
| 1104.0 | 0 |
| 1103.0 | 0 |
| 1102.0 | 0 |
| 1101.0 | 0 |
| 1100.0 | 0 |
| 1099.0 | 0 |
| 1098.0 | 0 |
| 1097.0 | 0 |
| 1096.0 | 0 |
| 1095.0 | 0 |
| 1094.0 | 0 |
| 1093.0 | 0 |
| 1092.0 | 0 |
| 1091.0 | 0 |
| 1090.0 | 0 |
| 1089.0 | 0 |
| 1088.0 | 0 |
| 1087.0 | 0 |
| 1086.0 | 0 |
| 1085.0 | 0 |
| 1084.0 | 0 |
| 1083.0 | 0 |
| 1082.0 | 0 |
| 1081.0 | 0 |
| 1080.0 | 0 |
| 1079.0 | 0 |
| 1078.0 | 0 |
| 1077.0 | 0 |
| 1076.0 | 0 |
| 1075.0 | 0 |
| 1074.0 | 0 |
| 1073.0 | 0 |
| 1072.0 | 0 |
| 1071.0 | 0 |
| 1070.0 | 0 |
| 1069.0 | 0 |
| 1068.0 | 0 |
| 1067.0 | 0 |
| 1066.0 | 0 |
| 1065.0 | 0 |
| 1064.0 | 0 |
| 1063.0 | 0 |
| 1062.0 | 0 |
| 1061.0 | 0 |
| 1060.0 | 0 |
| 1059.0 | 0 |
| 1058.0 | 0 |
| 1057.0 | 0 |
| 1056.0 | 0 |
| 1055.0 | 0 |
| 1054.0 | 0 |
| 1053.0 | 0 |
| 1052.0 | 0 |
| 1051.0 | 0 |
| 1050.0 | 0 |
| 1049.0 | 0 |
| 1048.0 | 0 |
| 1047.0 | 0 |
| 1046.0 | 0 |
| 1045.0 | 0 |
| 1044.0 | 0 |
| 1043.0 | 0 |
| 1042.0 | 0 |
| 1041.0 | 0 |
| 1040.0 | 0 |
| 1039.0 | 0 |
| 1038.0 | 0 |
| 1037.0 | 0 |
| 1036.0 | 0 |
| 1035.0 | 0 |
| 1034.0 | 0 |
| 1033.0 | 0 |
| 1032.0 | 0 |
| 1031.0 | 0 |
| 1030.0 | 0 |
| 1029.0 | 0 |
| 1028.0 | 0 |
| 1027.0 | 0 |
| 1026.0 | 0 |
| 1025.0 | 0 |
| 1024.0 | 0 |
| 1023.0 | 0 |
| 1022.0 | 0 |
| 1021.0 | 0 |
| 1020.0 | 0 |
| 1019.0 | 0 |
| 1018.0 | 0 |
| 1017.0 | 0 |
| 1016.0 | 0 |
| 1015.0 | 0 |
| 1014.0 | 0 |
| 1013.0 | 0 |
| 1012.0 | 0 |
| 1011.0 | 0 |
| 1010.0 | 0 |
| 1009.0 | 0 |
| 1008.0 | 0 |
| 1007.0 | 0 |
| 1006.0 | 0 |
| 1005.0 | 0 |
| 1004.0 | 0 |
| 1003.0 | 0 |
| 1002.0 | 0 |
| 1001.0 | 0 |
| 1000.0 | 0 |
| 999.0 | 0 |
| 998.0 | 0 |
| 997.0 | 0 |
| 996.0 | 0 |
| 995.0 | 0 |
| 994.0 | 0 |
| 993.0 | 0 |
| 992.0 | 0 |
| 991.0 | 0 |
| 990.0 | 0 |
| 989.0 | 0 |
| 988.0 | 0 |
| 987.0 | 0 |
| 986.0 | 0 |
| 985.0 | 0 |
| 984.0 | 0 |
| 983.0 | 0 |
| 982.0 | 0 |
| 981.0 | 0 |
| 980.0 | 0 |
| 979.0 | 0 |
| 978.0 | 0 |
| 977.0 | 0 |
| 976.0 | 0 |
| 975.0 | 0 |
| 974.0 | 0 |
| 973.0 | 0 |
| 972.0 | 0 |
| 971.0 | 0 |
| 970.0 | 0 |
| 969.0 | 0 |
| 968.0 | 0 |
| 967.0 | 0 |
| 966.0 | 0 |
| 965.0 | 0 |
| 964.0 | 0 |
| 963.0 | 0 |
| 962.0 | 0 |
| 961.0 | 0 |
| 960.0 | 0 |
| 959.0 | 0 |
| 958.0 | 0 |
| 957.0 | 0 |
| 956.0 | 0 |
| 955.0 | 0 |
| 954.0 | 0 |
| 953.0 | 0 |
| 952.0 | 0 |
| 951.0 | 0 |
| 950.0 | 0 |
| 949.0 | 0 |
| 948.0 | 0 |
| 947.0 | 0 |
| 946.0 | 0 |
| 945.0 | 0 |
| 944.0 | 0 |
| 943.0 | 0 |
| 942.0 | 0 |
| 941.0 | 0 |
| 940.0 | 0 |
| 939.0 | 0 |
| 938.0 | 0 |
| 937.0 | 0 |
| 936.0 | 0 |
| 935.0 | 0 |
| 934.0 | 0 |
| 933.0 | 0 |
| 932.0 | 0 |
| 931.0 | 0 |
| 930.0 | 0 |
| 929.0 | 0 |
| 928.0 | 0 |
| 927.0 | 0 |
| 926.0 | 0 |
| 925.0 | 0 |
| 924.0 | 0 |
| 923.0 | 0 |
| 922.0 | 0 |
| 921.0 | 0 |
| 920.0 | 0 |
| 919.0 | 0 |
| 918.0 | 0 |
| 917.0 | 0 |
| 916.0 | 0 |
| 915.0 | 0 |
| 914.0 | 0 |
| 913.0 | 0 |
| 912.0 | 0 |
| 911.0 | 0 |
| 910.0 | 0 |
| 909.0 | 0 |
| 908.0 | 0 |
| 907.0 | 0 |
| 906.0 | 0 |
| 905.0 | 0 |
| 904.0 | 0 |
| 903.0 | 0 |
| 902.0 | 0 |
| 901.0 | 0 |
| 900.0 | 0 |
| 899.0 | 0 |
| 898.0 | 0 |
| 897.0 | 0 |
| 896.0 | 0 |
| 895.0 | 0 |
| 894.0 | 0 |
| 893.0 | 0 |
| 892.0 | 0 |
| 891.0 | 0 |
| 890.0 | 0 |
| 889.0 | 0 |
| 888.0 | 0 |
| 887.0 | 0 |
| 886.0 | 0 |
| 885.0 | 0 |
| 884.0 | 0 |
| 883.0 | 0 |
| 882.0 | 0 |
| 881.0 | 0 |
| 880.0 | 0 |
| 879.0 | 0 |
| 878.0 | 0 |
| 877.0 | 0 |
| 876.0 | 0 |
| 875.0 | 0 |
| 874.0 | 0 |
| 873.0 | 0 |
| 872.0 | 0 |
| 871.0 | 0 |
| 870.0 | 0 |
| 869.0 | 0 |
| 868.0 | 0 |
| 867.0 | 0 |
| 866.0 | 0 |
| 865.0 | 0 |
| 864.0 | 0.001 |
| 863.0 | 0.001 |
| 862.0 | 0.001 |
| 861.0 | 0.001 |
| 860.0 | 0.001 |
| 859.0 | 0.001 |
| 858.0 | 0.001 |
| 857.0 | 0.001 |
| 856.0 | 0.001 |
| 855.0 | 0.001 |
| 854.0 | 0.001 |
| 853.0 | 0.001 |
| 852.0 | 0.001 |
| 851.0 | 0.001 |
| 850.0 | 0.001 |
| 849.0 | 0.001 |
| 848.0 | 0.001 |
| 847.0 | 0.001 |
| 846.0 | 0.001 |
| 845.0 | 0.001 |
| 844.0 | 0.001 |
| 843.0 | 0.001 |
| 842.0 | 0.001 |
| 841.0 | 0.001 |
| 840.0 | 0.001 |
| 839.0 | 0.001 |
| 838.0 | 0.001 |
| 837.0 | 0.001 |
| 836.0 | 0.001 |
| 835.0 | 0.001 |
| 834.0 | 0.001 |
| 833.0 | 0.001 |
| 832.0 | 0.001 |
| 831.0 | 0.001 |
| 830.0 | 0.002 |
| 829.0 | 0.001 |
| 828.0 | 0.001 |
| 827.0 | 0.002 |
| 826.0 | 0.001 |
| 825.0 | 0.001 |
| 824.0 | 0.001 |
| 823.0 | 0.002 |
| 822.0 | 0.002 |
| 821.0 | 0.001 |
| 820.0 | 0.002 |
| 819.0 | 0.002 |
| 818.0 | 0.002 |
| 817.0 | 0.001 |
| 816.0 | 0.002 |
| 815.0 | 0.002 |
| 814.0 | 0.001 |
| 813.0 | 0.002 |
| 812.0 | 0.002 |
| 811.0 | 0.002 |
| 810.0 | 0.002 |
| 809.0 | 0.002 |
| 808.0 | 0.002 |
| 807.0 | 0.002 |
| 806.0 | 0.002 |
| 805.0 | 0.002 |
| 804.0 | 0.002 |
| 803.0 | 0.002 |
| 802.0 | 0.002 |
| 801.0 | 0.002 |
| 800.0 | 0.002 |
| 799.0 | 0 |
| 798.0 | 0 |
| 797.0 | 0 |
| 796.0 | 0 |
| 795.0 | 0 |
| 794.0 | 0 |
| 793.0 | 0 |
| 792.0 | 0.001 |
| 791.0 | 0.001 |
| 790.0 | 0.001 |
| 789.0 | 0.001 |
| 788.0 | 0.001 |
| 787.0 | 0.001 |
| 786.0 | 0.001 |
| 785.0 | 0.001 |
| 784.0 | 0.001 |
| 783.0 | 0.001 |
| 782.0 | 0.001 |
| 781.0 | 0.001 |
| 780.0 | 0.001 |
| 779.0 | 0.002 |
| 778.0 | 0.002 |
| 777.0 | 0.002 |
| 776.0 | 0.002 |
| 775.0 | 0.002 |
| 774.0 | 0.002 |
| 773.0 | 0.002 |
| 772.0 | 0.002 |
| 771.0 | 0.003 |
| 770.0 | 0.003 |
| 769.0 | 0.003 |
| 768.0 | 0.003 |
| 767.0 | 0.003 |
| 766.0 | 0.003 |
| 765.0 | 0.003 |
| 764.0 | 0.003 |
| 763.0 | 0.004 |
| 762.0 | 0.004 |
| 761.0 | 0.004 |
| 760.0 | 0.004 |
| 759.0 | 0.004 |
| 758.0 | 0.004 |
| 757.0 | 0.004 |
| 756.0 | 0.004 |
| 755.0 | 0.005 |
| 754.0 | 0.005 |
| 753.0 | 0.005 |
| 752.0 | 0.005 |
| 751.0 | 0.006 |
| 750.0 | 0.006 |
| 749.0 | 0.006 |
| 748.0 | 0.006 |
| 747.0 | 0.007 |
| 746.0 | 0.007 |
| 745.0 | 0.008 |
| 744.0 | 0.008 |
| 743.0 | 0.009 |
| 742.0 | 0.01 |
| 741.0 | 0.01 |
| 740.0 | 0.011 |
| 739.0 | 0.013 |
| 738.0 | 0.014 |
| 737.0 | 0.015 |
| 736.0 | 0.017 |
| 735.0 | 0.018 |
| 734.0 | 0.02 |
| 733.0 | 0.023 |
| 732.0 | 0.026 |
| 731.0 | 0.029 |
| 730.0 | 0.033 |
| 729.0 | 0.038 |
| 728.0 | 0.043 |
| 727.0 | 0.05 |
| 726.0 | 0.058 |
| 725.0 | 0.068 |
| 724.0 | 0.079 |
| 723.0 | 0.094 |
| 722.0 | 0.112 |
| 721.0 | 0.134 |
| 720.0 | 0.162 |
| 719.0 | 0.198 |
| 718.0 | 0.243 |
| 717.0 | 0.304 |
| 716.0 | 0.383 |
| 715.0 | 0.491 |
| 714.0 | 0.64 |
| 713.0 | 0.846 |
| 712.0 | 1.144 |
| 711.0 | 1.586 |
| 710.0 | 2.258 |
| 709.0 | 3.312 |
| 708.0 | 5.015 |
| 707.0 | 7.873 |
| 706.0 | 12.616 |
| 705.0 | 20.163 |
| 704.0 | 30.924 |
| 703.0 | 43.539 |
| 702.0 | 55.142 |
| 701.0 | 62.911 |
| 700.0 | 66.013 |
| 699.0 | 65.055 |
| 698.0 | 59.997 |
| 697.0 | 50.651 |
| 696.0 | 38.44 |
| 695.0 | 26.465 |
| 694.0 | 16.86 |
| 693.0 | 10.433 |
| 692.0 | 6.487 |
| 691.0 | 4.123 |
| 690.0 | 2.709 |
| 689.0 | 1.822 |
| 688.0 | 1.254 |
| 687.0 | 0.883 |
| 686.0 | 0.63 |
| 685.0 | 0.455 |
| 684.0 | 0.33 |
| 683.0 | 0.241 |
| 682.0 | 0.176 |
| 681.0 | 0.129 |
| 680.0 | 0.095 |
| 679.0 | 0.07 |
| 678.0 | 0.051 |
| 677.0 | 0.038 |
| 676.0 | 0.028 |
| 675.0 | 0.021 |
| 674.0 | 0.016 |
| 673.0 | 0.012 |
| 672.0 | 0.009 |
| 671.0 | 0.007 |
| 670.0 | 0.005 |
| 669.0 | 0.004 |
| 668.0 | 0.003 |
| 667.0 | 0.002 |
| 666.0 | 0.002 |
| 665.0 | 0.002 |
| 664.0 | 0.001 |
| 663.0 | 0.001 |
| 662.0 | 0.001 |
| 661.0 | 0.001 |
| 660.0 | 0.001 |
| 659.0 | 0 |
| 658.0 | 0 |
| 657.0 | 0 |
| 656.0 | 0 |
| 655.0 | 0 |
| 654.0 | 0 |
| 653.0 | 0 |
| 652.0 | 0 |
| 651.0 | 0 |
| 650.0 | 0 |
| 649.0 | 0 |
| 648.0 | 0 |
| 647.0 | 0 |
| 646.0 | 0 |
| 645.0 | 0 |
| 644.0 | 0 |
| 643.0 | 0 |
| 642.0 | 0 |
| 641.0 | 0 |
| 640.0 | 0 |
| 639.0 | 0 |
| 638.0 | 0 |
| 637.0 | 0 |
| 636.0 | 0 |
| 635.0 | 0 |
| 634.0 | 0 |
| 633.0 | 0 |
| 632.0 | 0 |
| 631.0 | 0 |
| 630.0 | 0 |
| 629.0 | 0 |
| 628.0 | 0 |
| 627.0 | 0 |
| 626.0 | 0 |
| 625.0 | 0 |
| 624.0 | 0 |
| 623.0 | 0 |
| 622.0 | 0 |
| 621.0 | 0 |
| 620.0 | 0 |
| 619.0 | 0 |
| 618.0 | 0 |
| 617.0 | 0 |
| 616.0 | 0 |
| 615.0 | 0 |
| 614.0 | 0 |
| 613.0 | 0 |
| 612.0 | 0 |
| 611.0 | 0 |
| 610.0 | 0 |
| 609.0 | 0 |
| 608.0 | 0 |
| 607.0 | 0 |
| 606.0 | 0 |
| 605.0 | 0 |
| 604.0 | 0 |
| 603.0 | 0 |
| 602.0 | 0 |
| 601.0 | 0 |
| 600.0 | 0 |
| 599.0 | 0 |
| 598.0 | 0 |
| 597.0 | 0 |
| 596.0 | 0 |
| 595.0 | 0 |
| 594.0 | 0 |
| 593.0 | 0 |
| 592.0 | 0 |
| 591.0 | 0 |
| 590.0 | 0 |
| 589.0 | 0 |
| 588.0 | 0 |
| 587.0 | 0 |
| 586.0 | 0 |
| 585.0 | 0 |
| 584.0 | 0 |
| 583.0 | 0 |
| 582.0 | 0 |
| 581.0 | 0 |
| 580.0 | 0 |
| 579.0 | 0 |
| 578.0 | 0 |
| 577.0 | 0 |
| 576.0 | 0 |
| 575.0 | 0 |
| 574.0 | 0 |
| 573.0 | 0 |
| 572.0 | 0 |
| 571.0 | 0 |
| 570.0 | 0 |
| 569.0 | 0 |
| 568.0 | 0 |
| 567.0 | 0 |
| 566.0 | 0 |
| 565.0 | 0 |
| 564.0 | 0 |
| 563.0 | 0 |
| 562.0 | 0 |
| 561.0 | 0 |
| 560.0 | 0 |
| 559.0 | 0 |
| 558.0 | 0 |
| 557.0 | 0 |
| 556.0 | 0 |
| 555.0 | 0 |
| 554.0 | 0 |
| 553.0 | 0 |
| 552.0 | 0 |
| 551.0 | 0 |
| 550.0 | 0 |
| 549.0 | 0 |
| 548.0 | 0 |
| 547.0 | 0 |
| 546.0 | 0 |
| 545.0 | 0 |
| 544.0 | 0 |
| 543.0 | 0 |
| 542.0 | 0 |
| 541.0 | 0 |
| 540.0 | 0 |
| 539.0 | 0 |
| 538.0 | 0 |
| 537.0 | 0 |
| 536.0 | 0 |
| 535.0 | 0 |
| 534.0 | 0 |
| 533.0 | 0 |
| 532.0 | 0 |
| 531.0 | 0 |
| 530.0 | 0 |
| 529.0 | 0 |
| 528.0 | 0 |
| 527.0 | 0 |
| 526.0 | 0 |
| 525.0 | 0 |
| 524.0 | 0 |
| 523.0 | 0 |
| 522.0 | 0 |
| 521.0 | 0 |
| 520.0 | 0 |
| 519.0 | 0 |
| 518.0 | 0 |
| 517.0 | 0 |
| 516.0 | 0 |
| 515.0 | 0 |
| 514.0 | 0 |
| 513.0 | 0 |
| 512.0 | 0 |
| 511.0 | 0 |
| 510.0 | 0 |
| 509.0 | 0 |
| 508.0 | 0 |
| 507.0 | 0 |
| 506.0 | 0 |
| 505.0 | 0 |
| 504.0 | 0 |
| 503.0 | 0 |
| 502.0 | 0 |
| 501.0 | 0 |
| 500.0 | 0 |
| 499.0 | 0 |
| 498.0 | 0 |
| 497.0 | 0 |
| 496.0 | 0 |
| 495.0 | 0 |
| 494.0 | 0 |
| 493.0 | 0 |
| 492.0 | 0 |
| 491.0 | 0 |
| 490.0 | 0 |
| 489.0 | 0 |
| 488.0 | 0 |
| 487.0 | 0 |
| 486.0 | 0 |
| 485.0 | 0 |
| 484.0 | 0 |
| 483.0 | 0 |
| 482.0 | 0 |
| 481.0 | 0 |
| 480.0 | 0 |
| 479.0 | 0 |
| 478.0 | 0 |
| 477.0 | 0 |
| 476.0 | 0 |
| 475.0 | 0 |
| 474.0 | 0 |
| 473.0 | 0 |
| 472.0 | 0 |
| 471.0 | 0 |
| 470.0 | 0 |
| 469.0 | 0 |
| 468.0 | 0 |
| 467.0 | 0 |
| 466.0 | 0 |
| 465.0 | 0 |
| 464.0 | 0 |
| 463.0 | 0 |
| 462.0 | 0 |
| 461.0 | 0 |
| 460.0 | 0 |
| 459.0 | 0 |
| 458.0 | 0 |
| 457.0 | 0 |
| 456.0 | 0 |
| 455.0 | 0 |
| 454.0 | 0 |
| 453.0 | 0 |
| 452.0 | 0 |
| 451.0 | 0 |
| 450.0 | 0 |
| 449.0 | 0 |
| 448.0 | 0 |
| 447.0 | 0 |
| 446.0 | 0 |
| 445.0 | 0 |
| 444.0 | 0 |
| 443.0 | 0 |
| 442.0 | 0 |
| 441.0 | 0 |
| 440.0 | 0 |
| 439.0 | 0 |
| 438.0 | 0 |
| 437.0 | 0 |
| 436.0 | 0 |
| 435.0 | 0 |
| 434.0 | 0 |
| 433.0 | 0 |
| 432.0 | 0 |
| 431.0 | 0 |
| 430.0 | 0 |
| 429.0 | 0 |
| 428.0 | 0 |
| 427.0 | 0 |
| 426.0 | 0 |
| 425.0 | 0 |
| 424.0 | 0 |
| 423.0 | 0 |
| 422.0 | 0 |
| 421.0 | 0 |
| 420.0 | 0 |
| 419.0 | 0 |
| 418.0 | 0 |
| 417.0 | 0 |
| 416.0 | 0 |
| 415.0 | 0 |
| 414.0 | 0 |
| 413.0 | 0 |
| 412.0 | 0 |
| 411.0 | 0 |
| 410.0 | 0 |
| 409.0 | 0 |
| 408.0 | 0 |
| 407.0 | 0 |
| 406.0 | 0 |
| 405.0 | 0 |
| 404.0 | 0 |
| 403.0 | 0 |
| 402.0 | 0 |
| 401.0 | 0 |
| 400.0 | 0 |
| 399.0 | 0 |
| 398.0 | 0 |
| 397.0 | 0 |
| 396.0 | 0 |
| 395.0 | 0 |
| 394.0 | 0 |
| 393.0 | 0 |
| 392.0 | 0 |
| 391.0 | 0 |
| 390.0 | 0 |
| 389.0 | 0 |
| 388.0 | 0 |
| 387.0 | 0 |
| 386.0 | 0 |
| 385.0 | 0 |
| 384.0 | 0 |
| 383.0 | 0 |
| 382.0 | 0 |
| 381.0 | 0 |
| 380.0 | 0 |
| 379.0 | 0 |
| 378.0 | 0 |
| 377.0 | 0 |
| 376.0 | 0 |
| 375.0 | 0 |
| 374.0 | 0 |
| 373.0 | 0 |
| 372.0 | 0 |
| 371.0 | 0 |
| 370.0 | 0 |
| 369.0 | 0 |
| 368.0 | 0 |
| 367.0 | 0 |
| 366.0 | 0 |
| 365.0 | 0 |
| 364.0 | 0 |
| 363.0 | 0 |
| 362.0 | 0 |
| 361.0 | 0 |
| 360.0 | 0 |
| 359.0 | 0 |
| 358.0 | 0 |
| 357.0 | 0 |
| 356.0 | 0 |
| 355.0 | 0 |
| 354.0 | 0 |
| 353.0 | 0 |
| 352.0 | 0 |
| 351.0 | 0 |
| 350.0 | 0 |
| 349.0 | 0 |
| 348.0 | 0 |
| 347.0 | 0 |
| 346.0 | 0 |
| 345.0 | 0 |
| 344.0 | 0 |
| 343.0 | 0 |
| 342.0 | 0 |
| 341.0 | 0 |
| 340.0 | 0 |
| 339.0 | 0 |
| 338.0 | 0 |
| 337.0 | 0 |
| 336.0 | 0 |
| 335.0 | 0 |
| 334.0 | 0 |
| 333.0 | 0 |
| 332.0 | 0 |
| 331.0 | 0 |
| 330.0 | 0 |
| 329.0 | 0 |
| 328.0 | 0 |
| 327.0 | 0 |
| 326.0 | 0 |
| 325.0 | 0 |
| 324.0 | 0 |
| 323.0 | 0 |
| 322.0 | 0 |
| 321.0 | 0 |
| 320.0 | 0 |
| 319.0 | 0 |
| 318.0 | 0 |
| 317.0 | 0 |
| 316.0 | 0 |
| 315.0 | 0 |
| 314.0 | 0 |
| 313.0 | 0 |
| 312.0 | 0 |
| 311.0 | 0 |
| 310.0 | 0 |
| 309.0 | 0 |
| 308.0 | 0 |
| 307.0 | 0 |
| 306.0 | 0 |
| 305.0 | 0 |
| 304.0 | 0 |
| 303.0 | 0 |
| 302.0 | 0 |
| 301.0 | 0 |
| 300.0 | 0 |
| 299.0 | 0 |
| 298.0 | 0 |
| 297.0 | 0 |
| 296.0 | 0 |
| 295.0 | 0 |
| 294.0 | 0 |
| 293.0 | 0 |
| 292.0 | 0 |
| 291.0 | 0 |
| 290.0 | 0 |
| 289.0 | 0 |
| 288.0 | 0 |
| 287.0 | 0 |
| 286.0 | 0 |
| 285.0 | 0 |
| 284.0 | 0 |
| 283.0 | 0 |